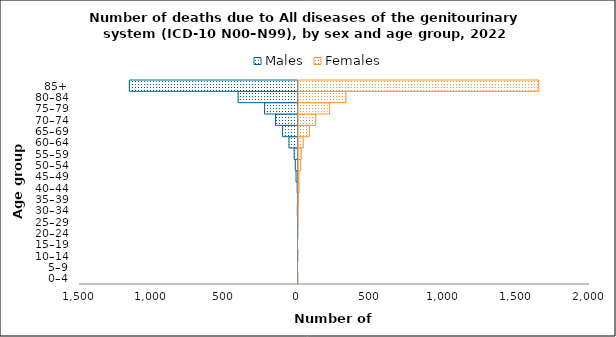
| Category | Males | Females |
|---|---|---|
| 0–4 | 0 | 1 |
| 5–9 | 0 | 0 |
| 10–14 | -1 | 0 |
| 15–19 | 0 | 0 |
| 20–24 | -1 | 0 |
| 25–29 | -2 | 1 |
| 30–34 | -5 | 3 |
| 35–39 | -2 | 4 |
| 40–44 | -6 | 10 |
| 45–49 | -14 | 9 |
| 50–54 | -19 | 22 |
| 55–59 | -27 | 25 |
| 60–64 | -62 | 39 |
| 65–69 | -106 | 81 |
| 70–74 | -155 | 125 |
| 75–79 | -230 | 220 |
| 80–84 | -411 | 332 |
| 85+ | -1158 | 1655 |